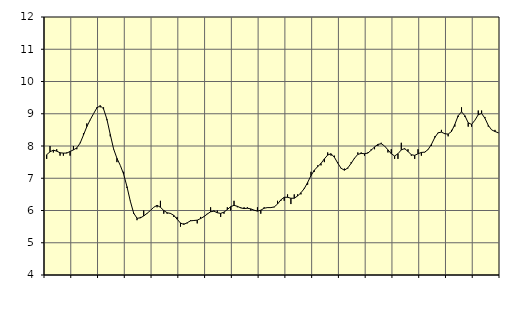
| Category | Piggar | Byggverksamhet, SNI 41-43 |
|---|---|---|
| nan | 7.6 | 7.73 |
| 87.0 | 8 | 7.82 |
| 87.0 | 7.8 | 7.87 |
| 87.0 | 7.9 | 7.84 |
| nan | 7.7 | 7.79 |
| 88.0 | 7.7 | 7.78 |
| 88.0 | 7.8 | 7.78 |
| 88.0 | 7.7 | 7.83 |
| nan | 8 | 7.88 |
| 89.0 | 7.9 | 7.94 |
| 89.0 | 8.1 | 8.09 |
| 89.0 | 8.4 | 8.34 |
| nan | 8.7 | 8.6 |
| 90.0 | 8.8 | 8.81 |
| 90.0 | 9 | 9 |
| 90.0 | 9.2 | 9.18 |
| nan | 9.2 | 9.25 |
| 91.0 | 9.2 | 9.15 |
| 91.0 | 8.8 | 8.83 |
| 91.0 | 8.3 | 8.36 |
| nan | 7.9 | 7.91 |
| 92.0 | 7.5 | 7.62 |
| 92.0 | 7.4 | 7.4 |
| 92.0 | 7.2 | 7.13 |
| nan | 6.7 | 6.74 |
| 93.0 | 6.3 | 6.29 |
| 93.0 | 5.9 | 5.92 |
| 93.0 | 5.7 | 5.76 |
| nan | 5.8 | 5.77 |
| 94.0 | 6 | 5.83 |
| 94.0 | 5.9 | 5.91 |
| 94.0 | 6 | 6 |
| nan | 6.1 | 6.1 |
| 95.0 | 6.1 | 6.16 |
| 95.0 | 6.3 | 6.1 |
| 95.0 | 5.9 | 6 |
| nan | 5.9 | 5.93 |
| 96.0 | 5.9 | 5.91 |
| 96.0 | 5.8 | 5.85 |
| 96.0 | 5.8 | 5.73 |
| nan | 5.5 | 5.61 |
| 97.0 | 5.6 | 5.57 |
| 97.0 | 5.6 | 5.62 |
| 97.0 | 5.7 | 5.68 |
| nan | 5.7 | 5.69 |
| 98.0 | 5.6 | 5.7 |
| 98.0 | 5.8 | 5.75 |
| 98.0 | 5.8 | 5.81 |
| nan | 5.9 | 5.89 |
| 99.0 | 6.1 | 5.96 |
| 99.0 | 6 | 5.98 |
| 99.0 | 6 | 5.93 |
| nan | 5.8 | 5.91 |
| 0.0 | 5.9 | 5.95 |
| 0.0 | 6.1 | 6.03 |
| 0.0 | 6 | 6.12 |
| nan | 6.3 | 6.16 |
| 1.0 | 6.1 | 6.13 |
| 1.0 | 6.1 | 6.08 |
| 1.0 | 6.1 | 6.06 |
| nan | 6.1 | 6.07 |
| 2.0 | 6 | 6.05 |
| 2.0 | 6 | 6.01 |
| 2.0 | 6.1 | 5.98 |
| nan | 5.9 | 6.01 |
| 3.0 | 6.1 | 6.07 |
| 3.0 | 6.1 | 6.09 |
| 3.0 | 6.1 | 6.09 |
| nan | 6.1 | 6.11 |
| 4.0 | 6.3 | 6.2 |
| 4.0 | 6.3 | 6.33 |
| 4.0 | 6.3 | 6.41 |
| nan | 6.5 | 6.41 |
| 5.0 | 6.2 | 6.38 |
| 5.0 | 6.5 | 6.38 |
| 5.0 | 6.5 | 6.45 |
| nan | 6.5 | 6.55 |
| 6.0 | 6.7 | 6.68 |
| 6.0 | 6.8 | 6.87 |
| 6.0 | 7.2 | 7.08 |
| nan | 7.2 | 7.25 |
| 7.0 | 7.4 | 7.36 |
| 7.0 | 7.4 | 7.46 |
| 7.0 | 7.5 | 7.6 |
| nan | 7.8 | 7.72 |
| 8.0 | 7.7 | 7.76 |
| 8.0 | 7.7 | 7.65 |
| 8.0 | 7.5 | 7.47 |
| nan | 7.3 | 7.31 |
| 9.0 | 7.3 | 7.25 |
| 9.0 | 7.3 | 7.32 |
| 9.0 | 7.5 | 7.46 |
| nan | 7.6 | 7.62 |
| 10.0 | 7.8 | 7.74 |
| 10.0 | 7.8 | 7.77 |
| 10.0 | 7.7 | 7.76 |
| nan | 7.8 | 7.78 |
| 11.0 | 7.9 | 7.87 |
| 11.0 | 7.9 | 7.97 |
| 11.0 | 8 | 8.05 |
| nan | 8.1 | 8.07 |
| 12.0 | 8 | 8 |
| 12.0 | 7.8 | 7.88 |
| 12.0 | 7.9 | 7.76 |
| nan | 7.6 | 7.69 |
| 13.0 | 7.6 | 7.76 |
| 13.0 | 8.1 | 7.88 |
| 13.0 | 7.9 | 7.92 |
| nan | 7.9 | 7.83 |
| 14.0 | 7.7 | 7.73 |
| 14.0 | 7.6 | 7.71 |
| 14.0 | 7.9 | 7.76 |
| nan | 7.7 | 7.8 |
| 15.0 | 7.8 | 7.81 |
| 15.0 | 7.9 | 7.89 |
| 15.0 | 8 | 8.05 |
| nan | 8.3 | 8.26 |
| 16.0 | 8.4 | 8.41 |
| 16.0 | 8.5 | 8.43 |
| 16.0 | 8.4 | 8.38 |
| nan | 8.3 | 8.37 |
| 17.0 | 8.5 | 8.45 |
| 17.0 | 8.6 | 8.67 |
| 17.0 | 8.9 | 8.94 |
| nan | 9.2 | 9.06 |
| 18.0 | 8.9 | 8.94 |
| 18.0 | 8.6 | 8.72 |
| 18.0 | 8.6 | 8.67 |
| nan | 8.8 | 8.8 |
| 19.0 | 9.1 | 8.97 |
| 19.0 | 9.1 | 9.01 |
| 19.0 | 8.9 | 8.86 |
| nan | 8.6 | 8.64 |
| 20.0 | 8.5 | 8.5 |
| 20.0 | 8.5 | 8.45 |
| 20.0 | 8.4 | 8.41 |